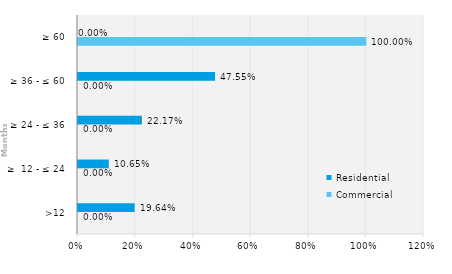
| Category | Commercial | Residential |
|---|---|---|
| >12 | 0 | 0.196 |
| ≥  12 - ≤ 24 | 0 | 0.107 |
| ≥ 24 - ≤ 36 | 0 | 0.222 |
| ≥ 36 - ≤ 60 | 0 | 0.475 |
| ≥ 60 | 1 | 0 |